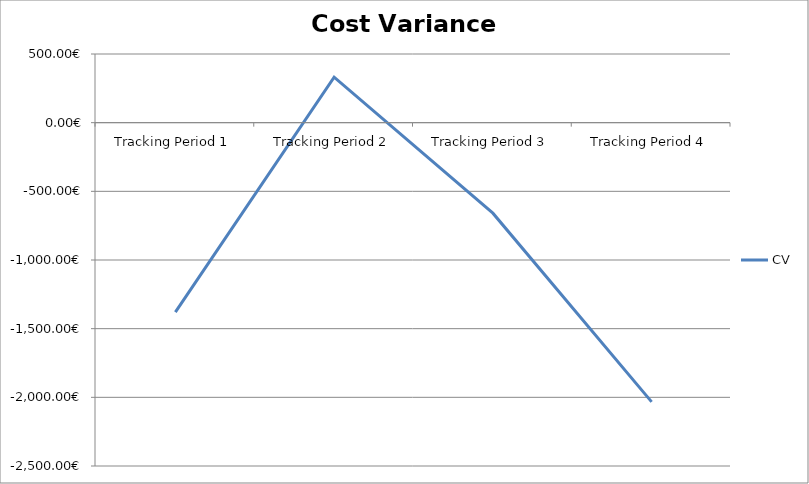
| Category | CV |
|---|---|
| Tracking Period 1 | -1379 |
| Tracking Period 2 | 331 |
| Tracking Period 3 | -659 |
| Tracking Period 4 | -2033 |